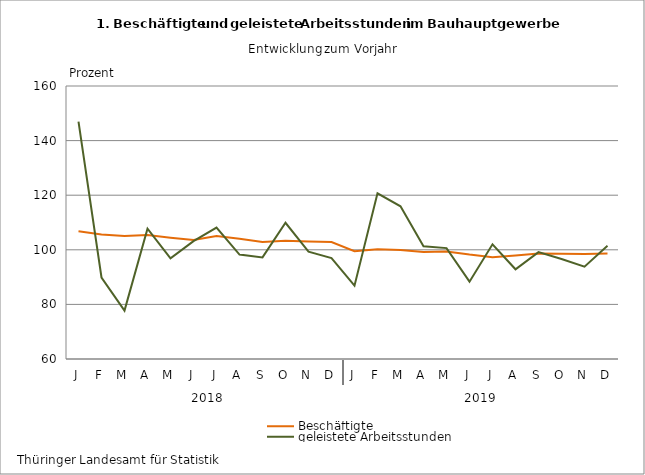
| Category | Beschäftigte | geleistete Arbeitsstunden |
|---|---|---|
| J | 106.795 | 146.972 |
| F | 105.588 | 89.846 |
| M | 105.07 | 77.729 |
| A | 105.452 | 107.751 |
| M | 104.451 | 96.869 |
| J | 103.613 | 103.161 |
| J | 105.068 | 108.145 |
| A | 104.068 | 98.247 |
| S | 102.827 | 97.222 |
| O | 103.283 | 109.885 |
| N | 103.033 | 99.33 |
| D | 102.85 | 96.978 |
| J | 99.489 | 86.864 |
| F | 100.237 | 120.71 |
| M | 99.918 | 115.95 |
| A | 99.218 | 101.318 |
| M | 99.401 | 100.626 |
| J | 98.256 | 88.324 |
| J | 97.316 | 102 |
| A | 97.933 | 92.858 |
| S | 98.689 | 99.157 |
| O | 98.527 | 96.624 |
| N | 98.491 | 93.81 |
| D | 98.625 | 101.47 |